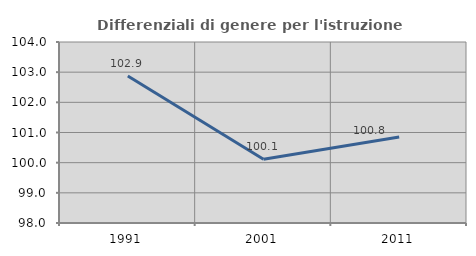
| Category | Differenziali di genere per l'istruzione superiore |
|---|---|
| 1991.0 | 102.875 |
| 2001.0 | 100.115 |
| 2011.0 | 100.849 |